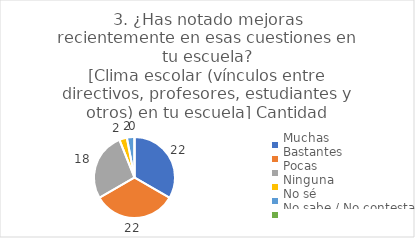
| Category | 3. ¿Has notado mejoras recientemente en esas cuestiones en tu escuela?
[Clima escolar (vínculos entre directivos, profesores, estudiantes y otros) en tu escuela] |
|---|---|
| Muchas  | 0.333 |
| Bastantes  | 0.333 |
| Pocas  | 0.273 |
| Ninguna  | 0.03 |
| No sé  | 0.03 |
| No sabe / No contesta | 0 |